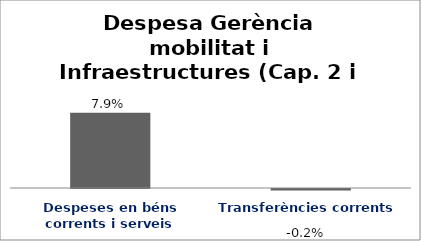
| Category | Series 0 |
|---|---|
| Despeses en béns corrents i serveis | 0.079 |
| Transferències corrents | -0.002 |